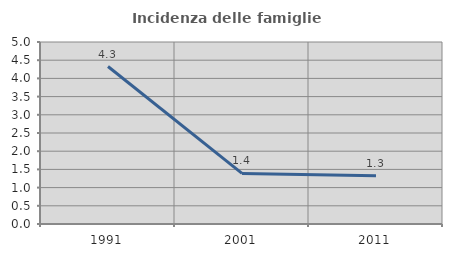
| Category | Incidenza delle famiglie numerose |
|---|---|
| 1991.0 | 4.327 |
| 2001.0 | 1.389 |
| 2011.0 | 1.329 |